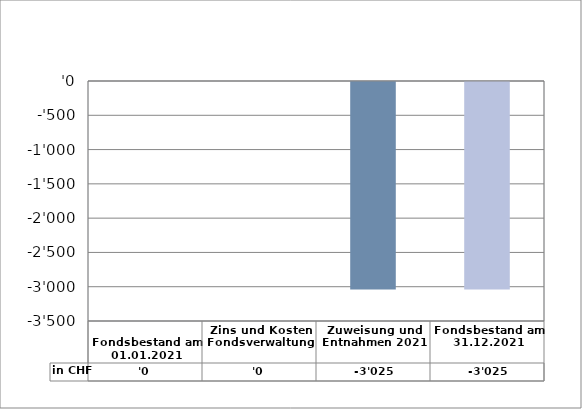
| Category | in CHF |
|---|---|
| 
Fondsbestand am 01.01.2021

 | 0 |
| Zins und Kosten Fondsverwaltung | 0 |
| Zuweisung und Entnahmen 2021 | -3025 |
| Fondsbestand am 31.12.2021 | -3025 |